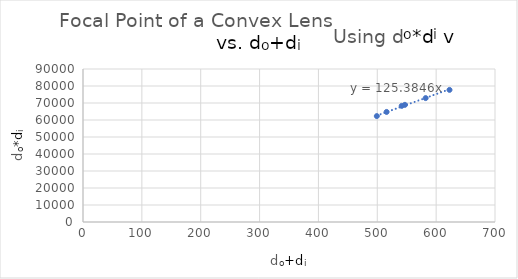
| Category | Series 0 |
|---|---|
| 541.5 | 68300 |
| 499.2 | 62300 |
| 515.8 | 64740 |
| 546.9 | 68915 |
| 582.2 | 72880 |
| 622.7 | 77715 |